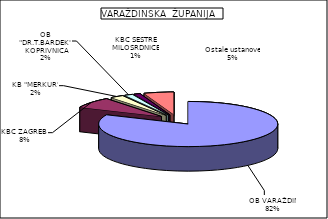
| Category | Series 0 |
|---|---|
| OB VARAŽDIN | 81.711 |
| KBC ZAGREB  | 7.777 |
| KB "MERKUR" | 2.428 |
| OB "DR.T.BARDEK" KOPRIVNICA | 1.502 |
| KBC SESTRE MILOSRDNICE | 1.159 |
| Ostale ustanove | 5.422 |